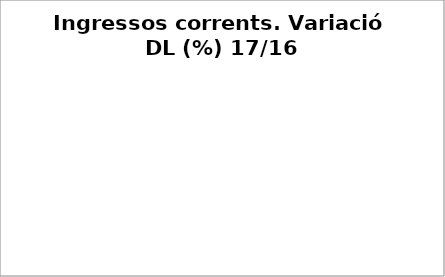
| Category | Series 0 |
|---|---|
| Impostos locals | 0.806 |
| Participació Tributs de l'Estat | 0 |
| Taxes i altres ingressos | -0.652 |
| Transferències corrents (exc. FCF) | -0.947 |
| Ingressos patrimonials | -0.08 |
| Ingressos corrents | -0.013 |